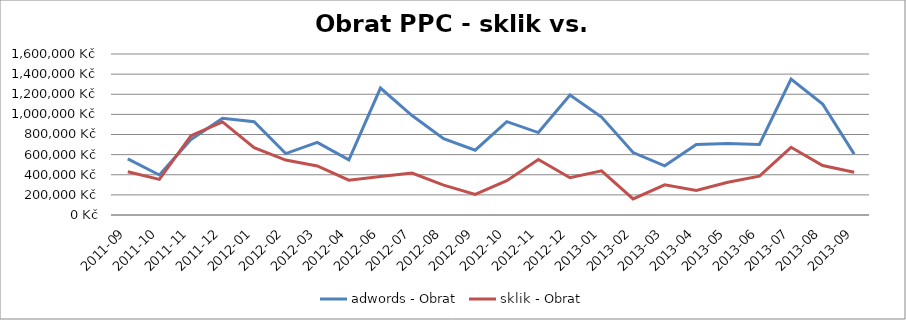
| Category | adwords - Obrat | sklik - Obrat |
|---|---|---|
| 2011-09 | 557429.648 | 430119.51 |
| 2011-10 | 397402.555 | 354106.108 |
| 2011-11 | 750916.45 | 787996.023 |
| 2011-12 | 960209.4 | 925360.882 |
| 2012-01 | 927028.845 | 669001.908 |
| 2012-02 | 610384.796 | 546088.716 |
| 2012-03 | 721664.105 | 487045.479 |
| 2012-04 | 548143.774 | 345608.492 |
| 2012-06 | 1261764.007 | 383240.742 |
| 2012-07 | 988486.723 | 416840.089 |
| 2012-08 | 759108.899 | 297465.817 |
| 2012-09 | 644394.238 | 205084.863 |
| 2012-10 | 928076.212 | 341590.961 |
| 2012-11 | 819341.438 | 551539.147 |
| 2012-12 | 1193421.903 | 370121.152 |
| 2013-01 | 973140.787 | 439017.412 |
| 2013-02 | 620556.914 | 159726.983 |
| 2013-03 | 489186.967 | 299674.674 |
| 2013-04 | 700749.445 | 243092.826 |
| 2013-05 | 710540.417 | 324644.72 |
| 2013-06 | 701384.987 | 386219.216 |
| 2013-07 | 1350828.155 | 672639.746 |
| 2013-08 | 1102837.211 | 492004.71 |
| 2013-09 | 604963.861 | 424715.266 |